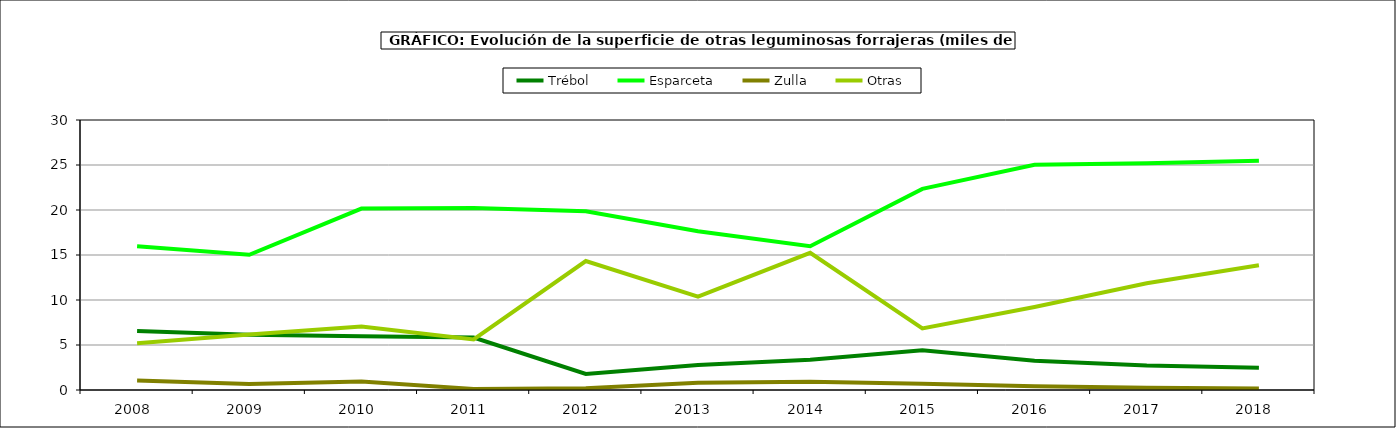
| Category | Trébol | Esparceta | Zulla | Otras |
|---|---|---|---|---|
| 2008.0 | 6.551 | 15.979 | 1.06 | 5.192 |
| 2009.0 | 6.149 | 15.028 | 0.667 | 6.159 |
| 2010.0 | 5.977 | 20.154 | 0.957 | 7.056 |
| 2011.0 | 5.836 | 20.216 | 0.117 | 5.61 |
| 2012.0 | 1.782 | 19.86 | 0.202 | 14.331 |
| 2013.0 | 2.77 | 17.645 | 0.8 | 10.366 |
| 2014.0 | 3.361 | 15.981 | 0.92 | 15.244 |
| 2015.0 | 4.404 | 22.35 | 0.693 | 6.846 |
| 2016.0 | 3.241 | 25.025 | 0.423 | 9.224 |
| 2017.0 | 2.711 | 25.183 | 0.247 | 11.87 |
| 2018.0 | 2.475 | 25.483 | 0.159 | 13.872 |